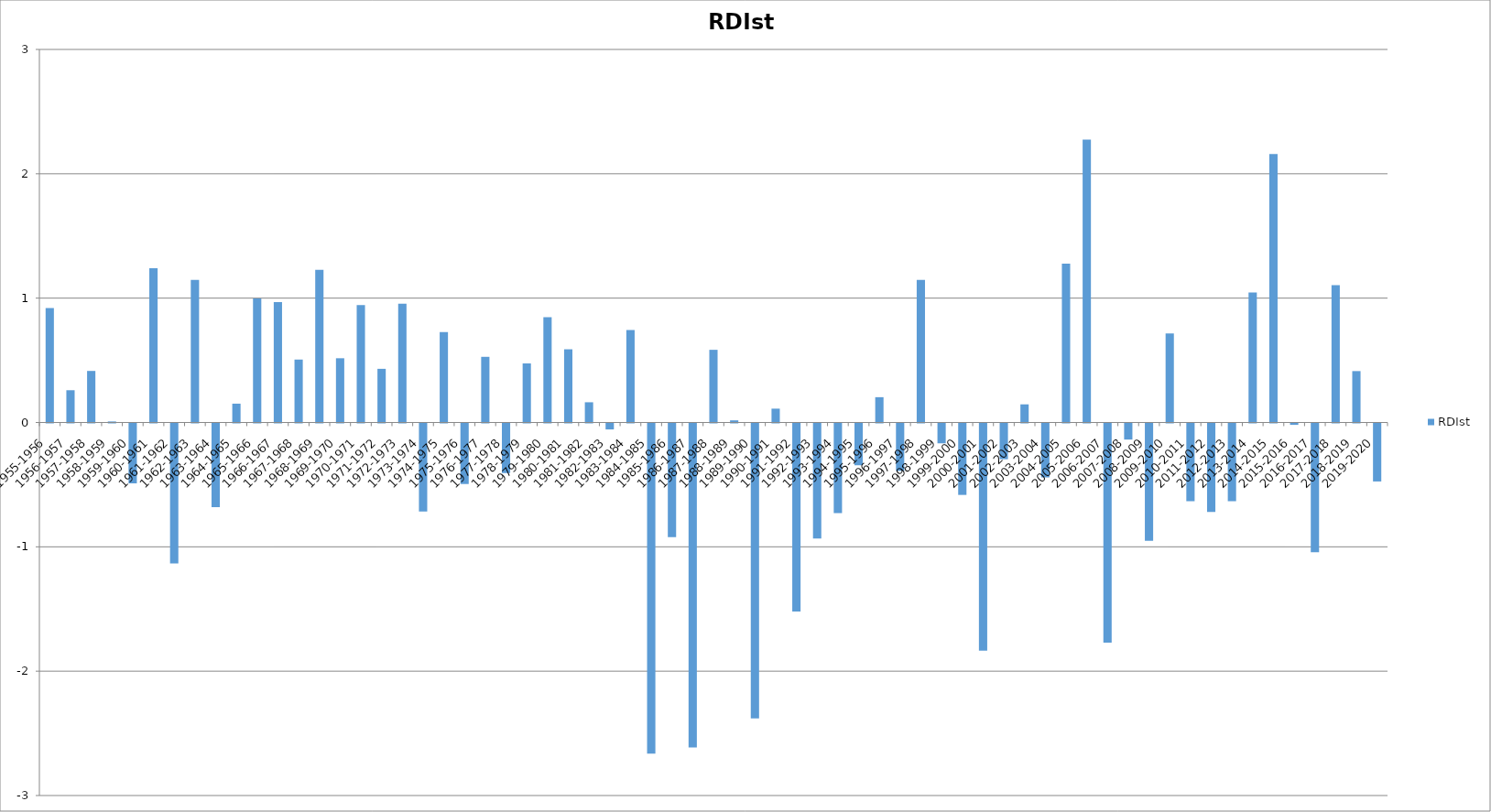
| Category | RDIst  |
|---|---|
| 1955-1956 | 0.919 |
| 1956-1957 | 0.259 |
| 1957-1958 | 0.415 |
| 1958-1959 | 0.008 |
| 1959-1960 | -0.482 |
| 1960-1961 | 1.24 |
| 1961-1962 | -1.127 |
| 1962-1963 | 1.146 |
| 1963-1964 | -0.673 |
| 1964-1965 | 0.151 |
| 1965-1966 | 0.997 |
| 1966-1967 | 0.968 |
| 1967-1968 | 0.506 |
| 1968-1969 | 1.227 |
| 1969-1970 | 0.517 |
| 1970-1971 | 0.944 |
| 1971-1972 | 0.431 |
| 1972-1973 | 0.955 |
| 1973-1974 | -0.708 |
| 1974-1975 | 0.726 |
| 1975-1976 | -0.487 |
| 1976-1977 | 0.528 |
| 1977-1978 | -0.399 |
| 1978-1979 | 0.475 |
| 1979-1980 | 0.846 |
| 1980-1981 | 0.589 |
| 1981-1982 | 0.163 |
| 1982-1983 | -0.049 |
| 1983-1984 | 0.744 |
| 1984-1985 | -2.656 |
| 1985-1986 | -0.914 |
| 1986-1987 | -2.606 |
| 1987-1988 | 0.584 |
| 1988-1989 | 0.017 |
| 1989-1990 | -2.373 |
| 1990-1991 | 0.111 |
| 1991-1992 | -1.512 |
| 1992-1993 | -0.926 |
| 1993-1994 | -0.721 |
| 1994-1995 | -0.337 |
| 1995-1996 | 0.203 |
| 1996-1997 | -0.382 |
| 1997-1998 | 1.146 |
| 1998-1999 | -0.16 |
| 1999-2000 | -0.575 |
| 2000-2001 | -1.828 |
| 2001-2002 | -0.288 |
| 2002-2003 | 0.146 |
| 2003-2004 | -0.434 |
| 2004-2005 | 1.277 |
| 2005-2006 | 2.275 |
| 2006-2007 | -1.762 |
| 2007-2008 | -0.13 |
| 2008-2009 | -0.944 |
| 2009-2010 | 0.716 |
| 2010-2011 | -0.625 |
| 2011-2012 | -0.712 |
| 2012-2013 | -0.625 |
| 2013-2014 | 1.046 |
| 2014-2015 | 2.159 |
| 2015-2016 | -0.012 |
| 2016-2017 | -1.036 |
| 2017-2018 | 1.104 |
| 2018-2019 | 0.413 |
| 2019-2020 | -0.467 |